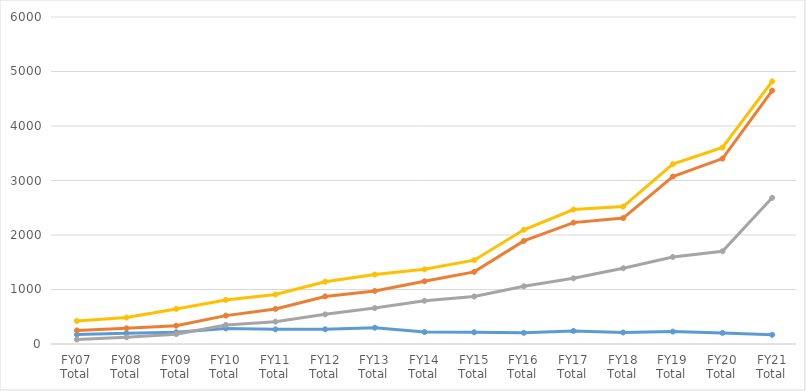
| Category | Partially Online | Fully Online | Fully Online, eTuition Only | Total Online, Including Collaboratives |
|---|---|---|---|---|
| FY07 Total | 173 | 249 | 82 | 422 |
| FY08 Total | 197 | 288 | 123 | 485 |
| FY09 Total | 215 | 336 | 181 | 643 |
| FY10 Total | 286 | 521 | 350 | 808 |
| FY11 Total | 269 | 644 | 410 | 908 |
| FY12 Total | 270 | 873 | 544 | 1143 |
| FY13 Total | 299 | 973 | 659 | 1275 |
| FY14 Total | 219 | 1151 | 794 | 1370 |
| FY15 Total | 215 | 1323 | 872 | 1538 |
| FY16 Total | 205 | 1891 | 1059 | 2096 |
| FY17 Total | 240 | 2227 | 1205 | 2467 |
| FY18 Total | 211 | 2310 | 1390 | 2521 |
| FY19 Total | 228 | 3072 | 1597 | 3300 |
| FY20 Total | 204 | 3402 | 1702 | 3606 |
| FY21 Total | 169 | 4650 | 2682 | 4819 |